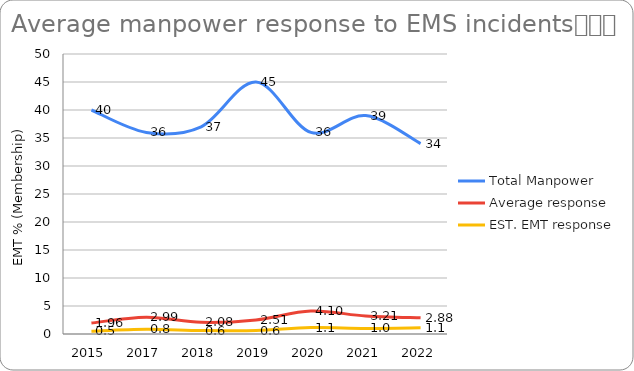
| Category | Total Manpower | Average response | EST. EMT response |
|---|---|---|---|
| 2015.0 | 40 | 1.96 | 0.49 |
| 2017.0 | 36 | 2.99 | 0.831 |
| 2018.0 | 37 | 2.08 | 0.618 |
| 2019.0 | 45 | 2.51 | 0.613 |
| 2020.0 | 36 | 4.1 | 1.139 |
| 2021.0 | 39 | 3.21 | 0.988 |
| 2022.0 | 34 | 2.88 | 1.101 |